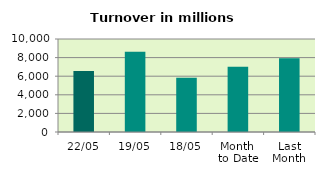
| Category | Series 0 |
|---|---|
| 22/05 | 6566.937 |
| 19/05 | 8625.895 |
| 18/05 | 5834.421 |
| Month 
to Date | 7024.114 |
| Last
Month | 7939.051 |